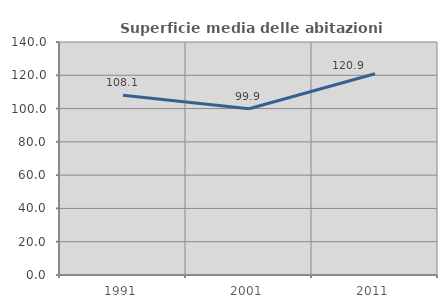
| Category | Superficie media delle abitazioni occupate |
|---|---|
| 1991.0 | 108.062 |
| 2001.0 | 99.93 |
| 2011.0 | 120.895 |